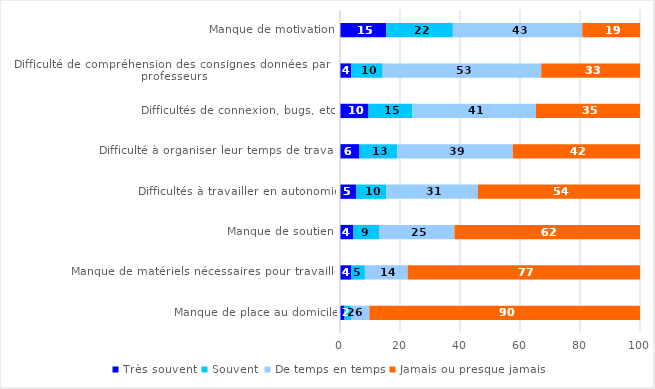
| Category | Très souvent | Souvent | De temps en temps | Jamais ou presque jamais |
|---|---|---|---|---|
| Manque de motivation | 15.44 | 22.17 | 43.16 | 19.22 |
| Difficulté de compréhension des consignes données par les professeurs | 3.76 | 10.46 | 52.85 | 32.94 |
| Difficultés de connexion, bugs, etc. | 9.52 | 14.62 | 41.17 | 34.68 |
| Difficulté à organiser leur temps de travail  | 6.49 | 12.61 | 38.5 | 42.41 |
| Difficultés à travailler en autonomie | 5.44 | 10.02 | 30.52 | 54.02 |
| Manque de soutien | 4.49 | 8.52 | 25.16 | 61.83 |
| Manque de matériels nécessaires pour travailler | 3.8 | 4.5 | 14.23 | 77.46 |
| Manque de place au domicile | 1.51 | 2.31 | 5.95 | 90.23 |